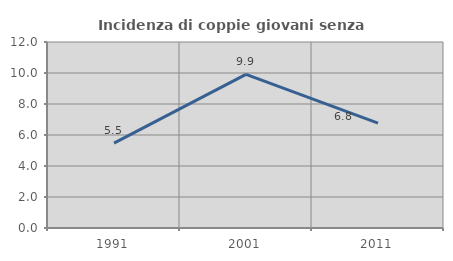
| Category | Incidenza di coppie giovani senza figli |
|---|---|
| 1991.0 | 5.476 |
| 2001.0 | 9.914 |
| 2011.0 | 6.763 |